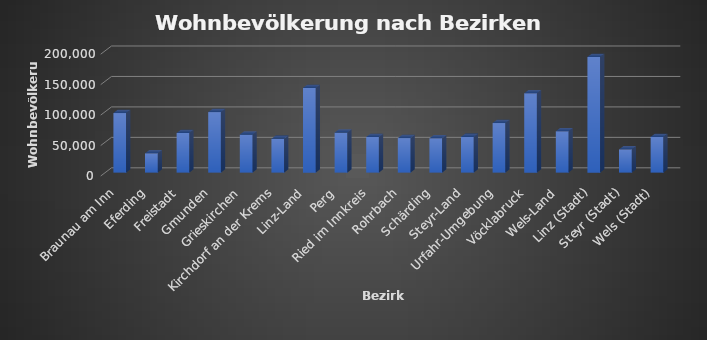
| Category | Wohnbevölkerung |
|---|---|
| Braunau am Inn | 97826 |
| Eferding | 31741 |
| Freistadt | 65113 |
| Gmunden | 99403 |
| Grieskirchen | 62555 |
| Kirchdorf an der Krems | 55557 |
| Linz-Land | 139116 |
| Perg | 65738 |
| Ried im Innkreis | 58553 |
| Rohrbach | 56688 |
| Schärding | 56426 |
| Steyr-Land | 58700 |
| Urfahr-Umgebung | 81400 |
| Vöcklabruck | 130316 |
| Wels-Land | 67945 |
| Linz (Stadt) | 189889 |
| Steyr (Stadt) | 38205 |
| Wels (Stadt) | 58591 |